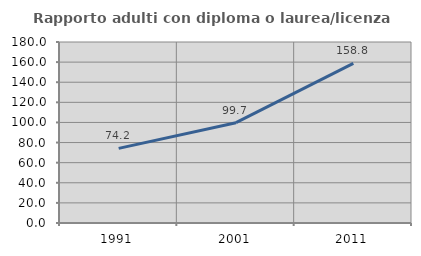
| Category | Rapporto adulti con diploma o laurea/licenza media  |
|---|---|
| 1991.0 | 74.219 |
| 2001.0 | 99.746 |
| 2011.0 | 158.779 |